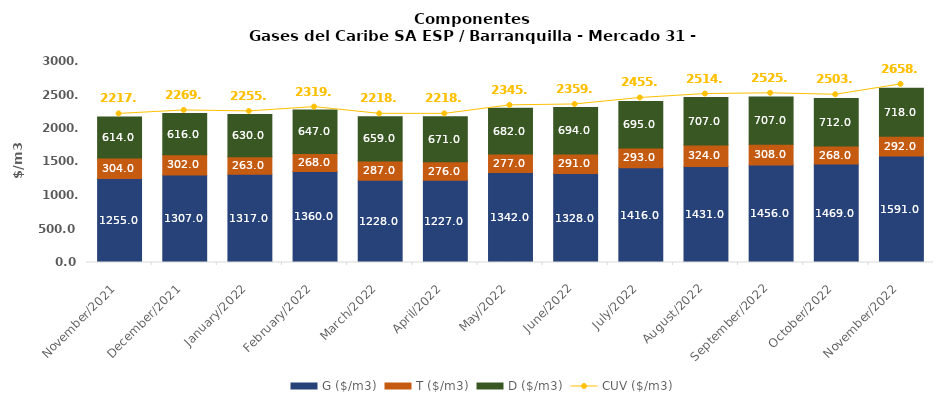
| Category | G ($/m3) | T ($/m3) | D ($/m3) |
|---|---|---|---|
| 2021-11-01 | 1255 | 304 | 614 |
| 2021-12-01 | 1307 | 302 | 616 |
| 2022-01-01 | 1317 | 263 | 630 |
| 2022-02-01 | 1360 | 268 | 647 |
| 2022-03-01 | 1228 | 287 | 659 |
| 2022-04-01 | 1227 | 276 | 671 |
| 2022-05-01 | 1342 | 277 | 682 |
| 2022-06-01 | 1328 | 291 | 694 |
| 2022-07-01 | 1416 | 293 | 695 |
| 2022-08-01 | 1431 | 324 | 707 |
| 2022-09-01 | 1456 | 308 | 707 |
| 2022-10-01 | 1469 | 268 | 712 |
| 2022-11-01 | 1591 | 292 | 718 |